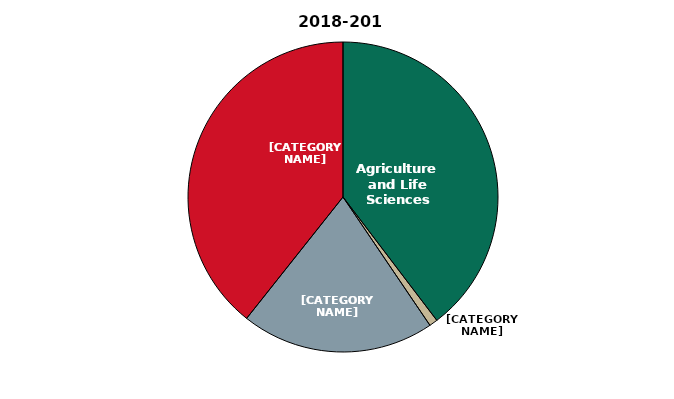
| Category | 2018-2019 |
|---|---|
| Agriculture and Life Sciences | 197682 |
| Design | 4345 |
| Human Sciences | 100485 |
| Interdisciplinary | 196043 |